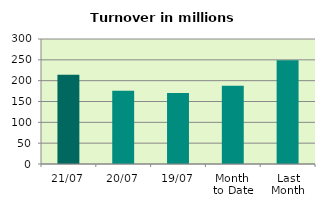
| Category | Series 0 |
|---|---|
| 21/07 | 214.225 |
| 20/07 | 175.779 |
| 19/07 | 170.617 |
| Month 
to Date | 188.041 |
| Last
Month | 248.976 |